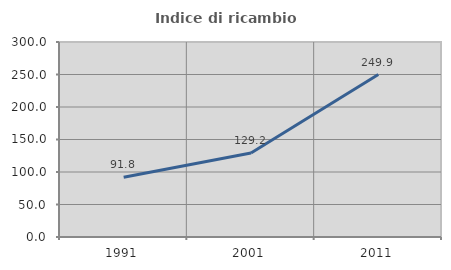
| Category | Indice di ricambio occupazionale  |
|---|---|
| 1991.0 | 91.848 |
| 2001.0 | 129.152 |
| 2011.0 | 249.903 |